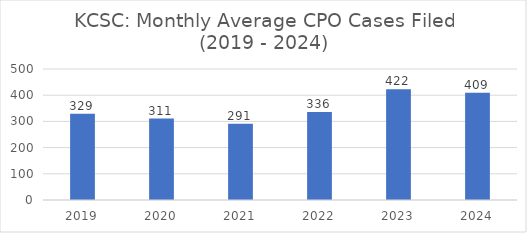
| Category | Monthly Average |
|---|---|
| 2019.0 | 328.833 |
| 2020.0 | 311 |
| 2021.0 | 291.25 |
| 2022.0 | 335.667 |
| 2023.0 | 422.417 |
| 2024.0 | 409.333 |